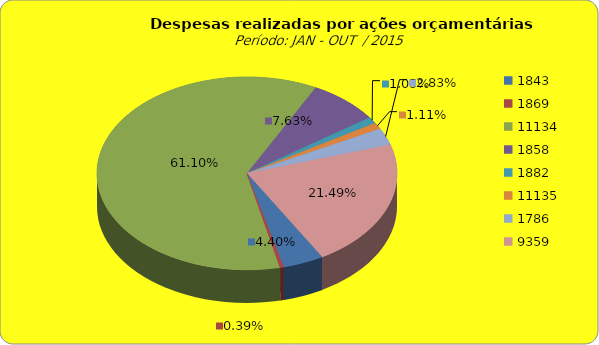
| Category | Series 1 |
|---|---|
| 1843.0 | 8197055.96 |
| 1869.0 | 723677.51 |
| 11134.0 | 113813883.83 |
| 1858.0 | 14221900.82 |
| 1882.0 | 1953113.89 |
| 11135.0 | 2069307.49 |
| 1786.0 | 5278836.11 |
| 9359.0 | 40030450.33 |